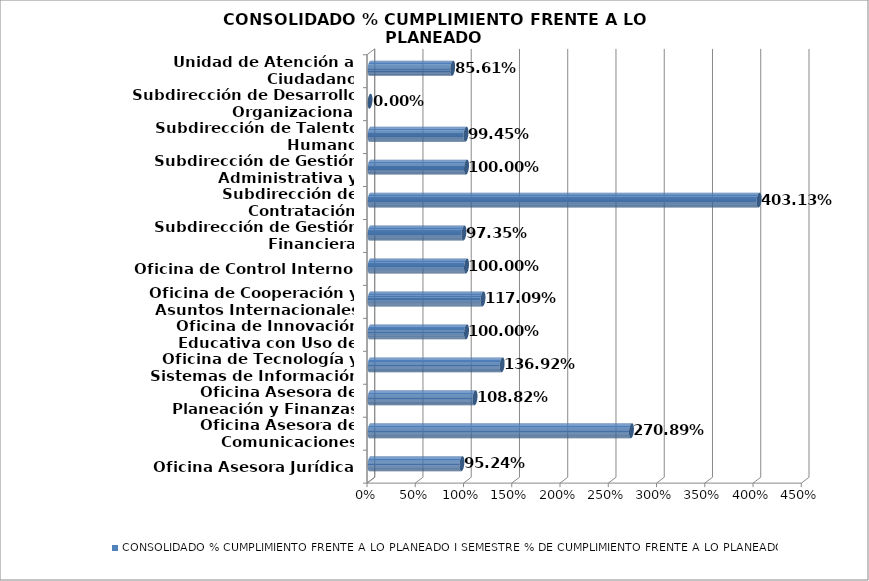
| Category | CONSOLIDADO % CUMPLIMIENTO FRENTE A LO PLANEADO I SEMESTRE |
|---|---|
| Oficina Asesora Jurídica | 0.952 |
| Oficina Asesora de Comunicaciones | 2.709 |
| Oficina Asesora de Planeación y Finanzas | 1.088 |
| Oficina de Tecnología y Sistemas de Información | 1.369 |
| Oficina de Innovación Educativa con Uso de Nuevas Tecnologías | 1 |
| Oficina de Cooperación y Asuntos Internacionales | 1.171 |
| Oficina de Control Interno | 1 |
| Subdirección de Gestión Financiera | 0.973 |
| Subdirección de Contratación | 4.031 |
| Subdirección de Gestión Administrativa y Operaciones  | 1 |
| Subdirección de Talento Humano | 0.994 |
| Subdirección de Desarrollo Organizacional | 0 |
| Unidad de Atención al Ciudadano | 0.856 |